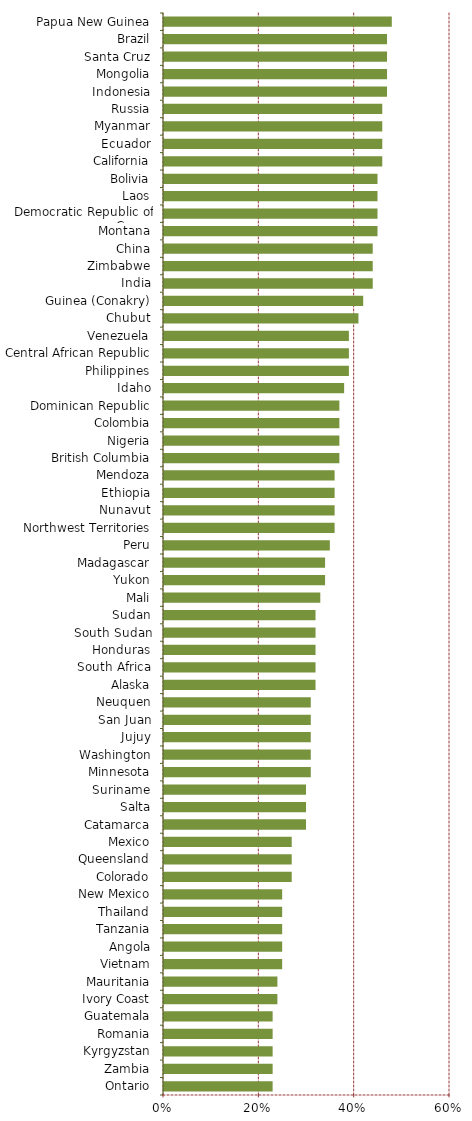
| Category | Series 0 |
|---|---|
| Ontario | 0.23 |
| Zambia | 0.23 |
| Kyrgyzstan | 0.23 |
| Romania | 0.23 |
| Guatemala | 0.23 |
| Ivory Coast | 0.24 |
| Mauritania | 0.24 |
| Vietnam | 0.25 |
| Angola | 0.25 |
| Tanzania | 0.25 |
| Thailand | 0.25 |
| New Mexico | 0.25 |
| Colorado | 0.27 |
| Queensland | 0.27 |
| Mexico | 0.27 |
| Catamarca | 0.3 |
| Salta | 0.3 |
| Suriname | 0.3 |
| Minnesota | 0.31 |
| Washington | 0.31 |
| Jujuy | 0.31 |
| San Juan | 0.31 |
| Neuquen | 0.31 |
| Alaska | 0.32 |
| South Africa | 0.32 |
| Honduras | 0.32 |
| South Sudan | 0.32 |
| Sudan | 0.32 |
| Mali | 0.33 |
| Yukon | 0.34 |
| Madagascar | 0.34 |
| Peru | 0.35 |
| Northwest Territories | 0.36 |
| Nunavut | 0.36 |
| Ethiopia | 0.36 |
| Mendoza | 0.36 |
| British Columbia | 0.37 |
| Nigeria | 0.37 |
| Colombia | 0.37 |
| Dominican Republic | 0.37 |
| Idaho | 0.38 |
| Philippines | 0.39 |
| Central African Republic | 0.39 |
| Venezuela | 0.39 |
| Chubut | 0.41 |
| Guinea (Conakry) | 0.42 |
| India | 0.44 |
| Zimbabwe | 0.44 |
| China | 0.44 |
| Montana | 0.45 |
| Democratic Republic of Congo | 0.45 |
| Laos | 0.45 |
| Bolivia | 0.45 |
| California | 0.46 |
| Ecuador | 0.46 |
| Myanmar | 0.46 |
| Russia | 0.46 |
| Indonesia | 0.47 |
| Mongolia | 0.47 |
| Santa Cruz | 0.47 |
| Brazil | 0.47 |
| Papua New Guinea | 0.48 |